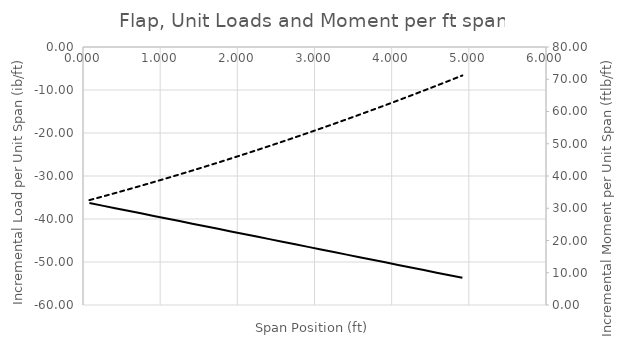
| Category | Series 0 |
|---|---|
| 0.08333333333333333 | -36.286 |
| 0.25 | -36.886 |
| 0.41666666666666663 | -37.486 |
| 0.5833333333333333 | -38.086 |
| 0.75 | -38.685 |
| 0.9166666666666665 | -39.285 |
| 1.0833333333333333 | -39.885 |
| 1.25 | -40.485 |
| 1.4166666666666665 | -41.084 |
| 1.5833333333333335 | -41.684 |
| 1.75 | -42.284 |
| 1.9166666666666667 | -42.884 |
| 2.083333333333333 | -43.484 |
| 2.25 | -44.083 |
| 2.416666666666666 | -44.683 |
| 2.583333333333333 | -45.283 |
| 2.749999999999999 | -45.883 |
| 2.916666666666666 | -46.482 |
| 3.083333333333332 | -47.082 |
| 3.249999999999999 | -47.682 |
| 3.416666666666665 | -48.282 |
| 3.583333333333332 | -48.882 |
| 3.7499999999999982 | -49.481 |
| 3.916666666666665 | -50.081 |
| 4.083333333333332 | -50.681 |
| 4.249999999999998 | -51.281 |
| 4.416666666666666 | -51.88 |
| 4.583333333333332 | -52.48 |
| 4.75 | -53.08 |
| 4.916666666666666 | -53.68 |